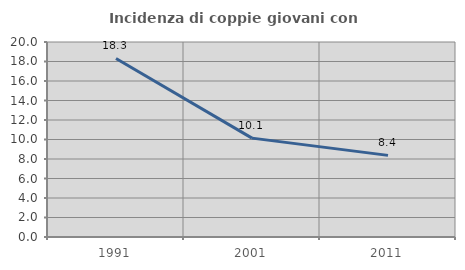
| Category | Incidenza di coppie giovani con figli |
|---|---|
| 1991.0 | 18.315 |
| 2001.0 | 10.141 |
| 2011.0 | 8.371 |